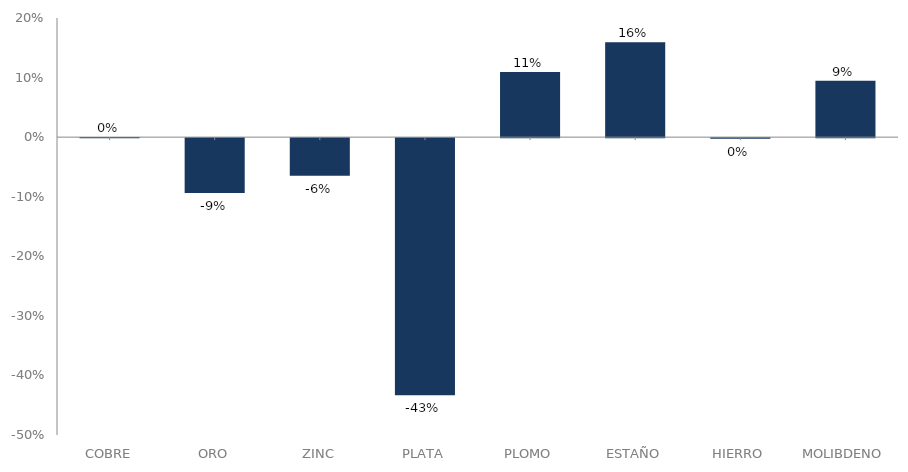
| Category | serie |
|---|---|
| 0 | 0 |
| 1 | -0.092 |
| 2 | -0.063 |
| 3 | -0.432 |
| 4 | 0.109 |
| 5 | 0.159 |
| 6 | -0.001 |
| 7 | 0.095 |